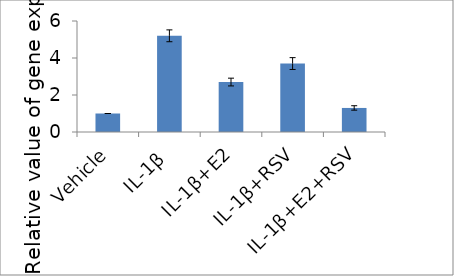
| Category | Series 0 |
|---|---|
| Vehicle | 1 |
| IL-1β | 5.2 |
| IL-1β+E2 | 2.7 |
| IL-1β+RSV | 3.7 |
| IL-1β+E2+RSV | 1.3 |